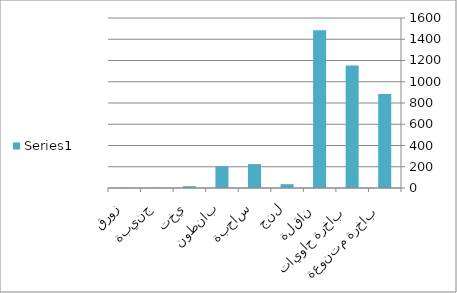
| Category | Series 0 |
|---|---|
| باخرة متنوعة  | 885 |
| باخرة حاويات  | 1153 |
| ناقلة  | 1485 |
| لنج | 36 |
| ساحبة | 225 |
| بانطون | 205 |
| يخت | 17 |
| جنيبة | 2 |
| زورق | 2 |